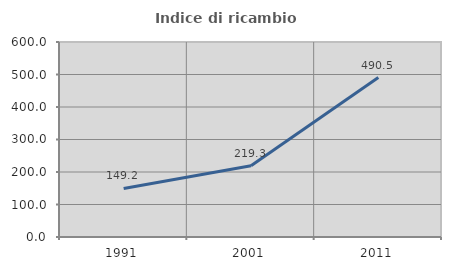
| Category | Indice di ricambio occupazionale  |
|---|---|
| 1991.0 | 149.243 |
| 2001.0 | 219.284 |
| 2011.0 | 490.463 |